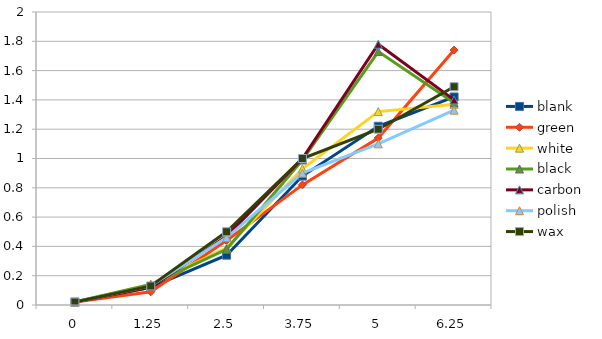
| Category | blank | green | white | black | carbon | polish | wax |
|---|---|---|---|---|---|---|---|
| 0 | 0.02 | 0.02 | 0.02 | 0.02 | 0.02 | 0.02 | 0.02 |
| 1.25 | 0.12 | 0.09 | 0.14 | 0.14 | 0.12 | 0.13 | 0.13 |
| 2.5 | 0.34 | 0.44 | 0.39 | 0.38 | 0.47 | 0.46 | 0.5 |
| 3.75 | 0.88 | 0.82 | 0.93 | 0.99 | 1 | 0.9 | 1 |
| 5 | 1.22 | 1.14 | 1.32 | 1.73 | 1.78 | 1.1 | 1.2 |
| 6.25 | 1.42 | 1.74 | 1.37 | 1.38 | 1.4 | 1.33 | 1.49 |